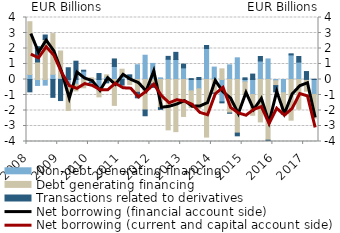
| Category | Non-debt generating financing | Debt generating financing | Transactions related to derivatives |
|---|---|---|---|
| 2008.0 | 0.322 | 3.407 | -0.797 |
| 2008.0 | -0.385 | 1.131 | 0.986 |
| 2008.0 | -0.364 | 2.578 | 0.292 |
| 2008.0 | 0.334 | 2.628 | -1.152 |
| 2009.0 | 0.096 | 1.742 | -1.358 |
| 2009.0 | -0.495 | -1.502 | 0.758 |
| 2009.0 | -0.31 | -0.426 | 1.181 |
| 2009.0 | 0.54 | -0.537 | 0.06 |
| 2010.0 | -0.188 | 0.108 | -0.028 |
| 2010.0 | -0.709 | -0.411 | 0.384 |
| 2010.0 | 0.167 | 0.134 | -0.216 |
| 2010.0 | 0.841 | -1.672 | 0.485 |
| 2011.0 | 0.279 | 0.384 | -0.362 |
| 2011.0 | -0.045 | -0.279 | 0.301 |
| 2011.0 | 0.951 | -0.827 | -0.355 |
| 2011.0 | 1.566 | -1.967 | -0.372 |
| 2012.0 | 1.038 | -0.282 | -0.228 |
| 2012.0 | 0.107 | -1.816 | -0.112 |
| 2012.0 | 1.307 | -3.251 | 0.185 |
| 2012.0 | 1.29 | -3.363 | 0.461 |
| 2013.0 | 0.752 | -2.385 | 0.238 |
| 2013.0 | -0.734 | -1.079 | 0.057 |
| 2013.0 | -0.601 | -1.268 | 0.129 |
| 2013.0 | 2.002 | -3.715 | 0.193 |
| 2014.0 | 0.8 | -0.873 | -0.015 |
| 2014.0 | -1.445 | 0.687 | -0.062 |
| 2014.0 | 0.944 | -2.164 | -0.012 |
| 2014.0 | 1.399 | -3.458 | -0.175 |
| 2015.0 | -0.156 | -0.816 | 0.108 |
| 2015.0 | -0.973 | -1.339 | 0.349 |
| 2015.0 | 1.195 | -2.737 | 0.289 |
| 2015.0 | 1.327 | -3.914 | -0.059 |
| 2016.0 | -0.081 | -0.31 | -0.406 |
| 2016.0 | -0.856 | -1.301 | -0.078 |
| 2016.0 | 1.587 | -2.624 | 0.07 |
| 2016.0 | 1.125 | -1.915 | 0.361 |
| 2017.0 | 0.006 | -0.755 | 0.507 |
| 2017.0 | -0.962 | -1.532 | 0.016 |